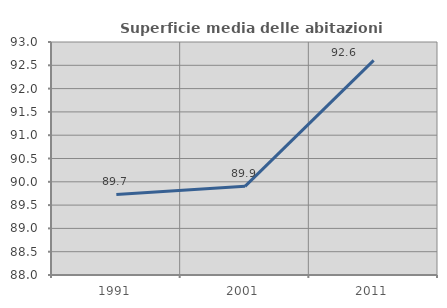
| Category | Superficie media delle abitazioni occupate |
|---|---|
| 1991.0 | 89.73 |
| 2001.0 | 89.903 |
| 2011.0 | 92.605 |